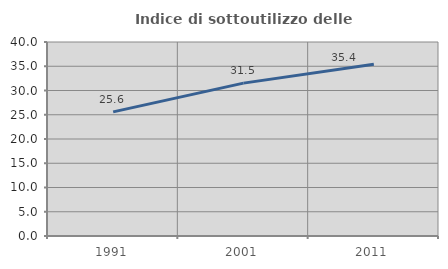
| Category | Indice di sottoutilizzo delle abitazioni  |
|---|---|
| 1991.0 | 25.586 |
| 2001.0 | 31.524 |
| 2011.0 | 35.417 |